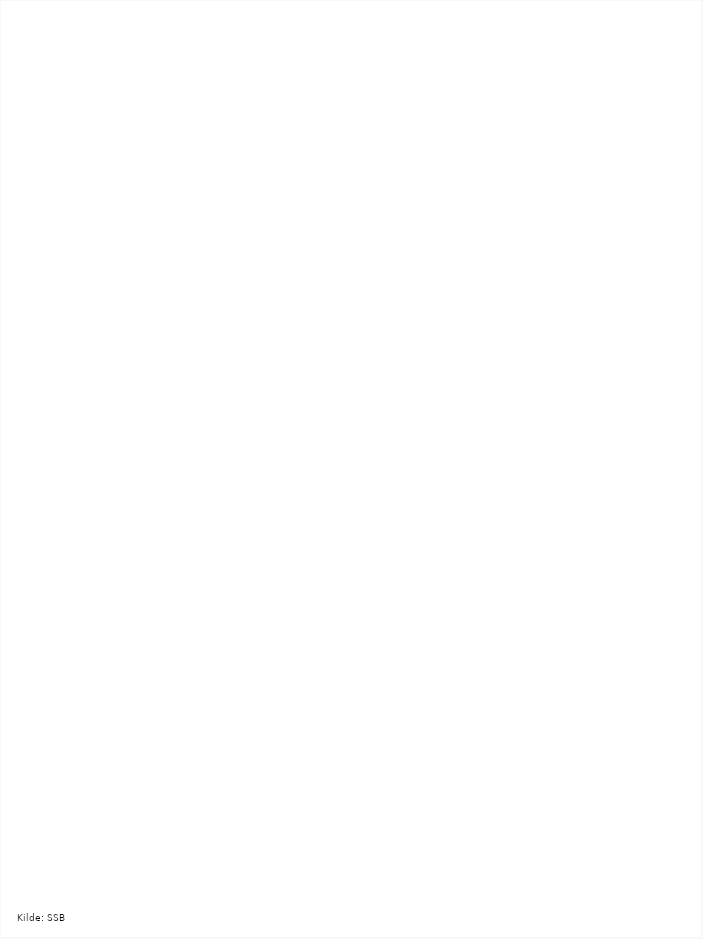
| Category | Totalt |
|---|---|
| Sør-Odal | 601 |
| Asker | 627 |
| Randaberg | 628 |
| Gran | 657 |
| Stjørdal | 666 |
| Molde | 669 |
| Osterøy | 691 |
| Hobøl | 696 |
| Orkdal | 701 |
| Ski | 702 |
| Hurum | 707 |
| Karmøy | 743 |
| Nes Ak. | 745 |
| Stavanger | 762 |
| Steinkjer | 792 |
| Ørsta | 859 |
| Stange | 966 |
| Sarpsborg | 967 |
| Ullensaker | 973 |
| Ørland | 1136 |
| Bergen | 1210 |
| Gjesdal | 1227 |
| Klepp | 1263 |
| Fredrikstad | 1311 |
| Time | 1375 |
| Ringsaker | 1887 |
| Melhus | 2371 |
| Sandnes | 2552 |
| Sola | 2814 |
| Trondheim | 3227 |